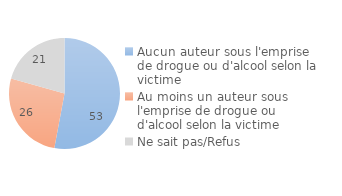
| Category | Series 0 |
|---|---|
| Aucun auteur sous l'emprise de drogue ou d'alcool selon la victime | 52.936 |
| Au moins un auteur sous l'emprise de drogue ou d'alcool selon la victime | 26.436 |
| Ne sait pas/Refus | 20.628 |